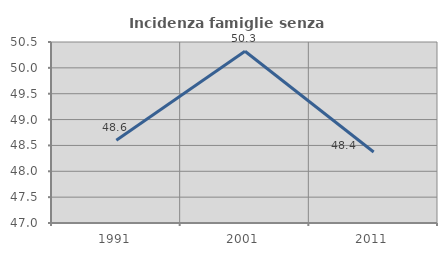
| Category | Incidenza famiglie senza nuclei |
|---|---|
| 1991.0 | 48.602 |
| 2001.0 | 50.321 |
| 2011.0 | 48.372 |